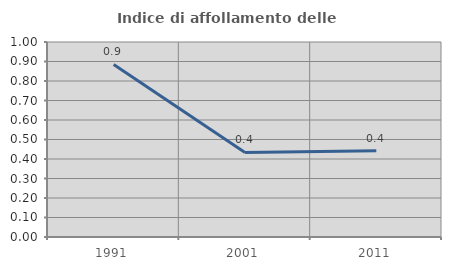
| Category | Indice di affollamento delle abitazioni  |
|---|---|
| 1991.0 | 0.885 |
| 2001.0 | 0.434 |
| 2011.0 | 0.442 |